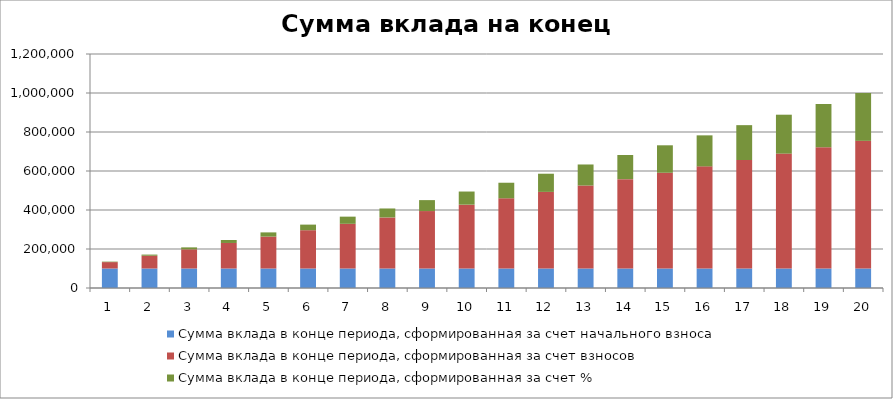
| Category | Сумма вклада в конце периода, сформированная за счет начального взноса | Сумма вклада в конце периода, сформированная за счет взносов | Сумма вклада в конце периода, сформированная за счет % |
|---|---|---|---|
| 0 | 100000 | 32732.416 | 2500 |
| 1 | 100000 | 65464.832 | 5880.81 |
| 2 | 100000 | 98197.248 | 10164.451 |
| 3 | 100000 | 130929.663 | 15373.494 |
| 4 | 100000 | 163662.079 | 21531.073 |
| 5 | 100000 | 196394.495 | 28660.902 |
| 6 | 100000 | 229126.911 | 36787.287 |
| 7 | 100000 | 261859.327 | 45935.142 |
| 8 | 100000 | 294591.743 | 56130.003 |
| 9 | 100000 | 327324.159 | 67398.047 |
| 10 | 100000 | 360056.574 | 79766.102 |
| 11 | 100000 | 392788.99 | 93261.669 |
| 12 | 100000 | 425521.406 | 107912.935 |
| 13 | 100000 | 458253.822 | 123748.794 |
| 14 | 100000 | 490986.238 | 140798.859 |
| 15 | 100000 | 523718.654 | 159093.487 |
| 16 | 100000 | 556451.07 | 178663.79 |
| 17 | 100000 | 589183.485 | 199541.662 |
| 18 | 100000 | 621915.901 | 221759.79 |
| 19 | 100000 | 654648.317 | 245351.683 |